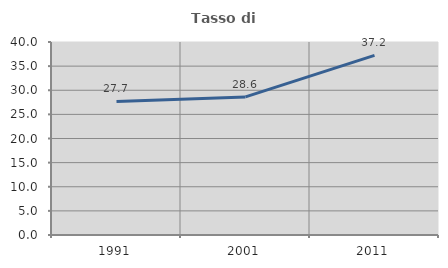
| Category | Tasso di occupazione   |
|---|---|
| 1991.0 | 27.671 |
| 2001.0 | 28.613 |
| 2011.0 | 37.225 |